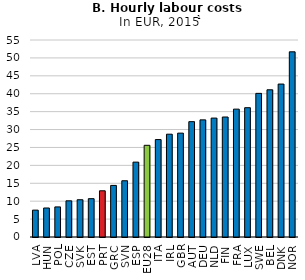
| Category | 2015 |
|---|---|
| LVA | 7.5 |
| HUN | 8.1 |
| POL | 8.4 |
| CZE | 10.1 |
| SVK | 10.4 |
| EST | 10.7 |
| PRT | 12.9 |
| GRC | 14.4 |
| SVN | 15.7 |
| ESP | 20.9 |
| EU28 | 25.6 |
| ITA | 27.2 |
| IRL | 28.7 |
| GBR | 29 |
| AUT | 32.2 |
| DEU | 32.7 |
| NLD | 33.2 |
| FIN | 33.5 |
| FRA | 35.7 |
| LUX | 36.1 |
| SWE | 40.1 |
| BEL | 41.1 |
| DNK | 42.7 |
| NOR | 51.7 |